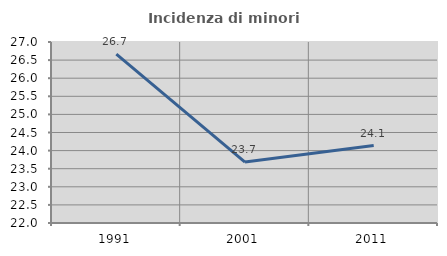
| Category | Incidenza di minori stranieri |
|---|---|
| 1991.0 | 26.667 |
| 2001.0 | 23.684 |
| 2011.0 | 24.138 |